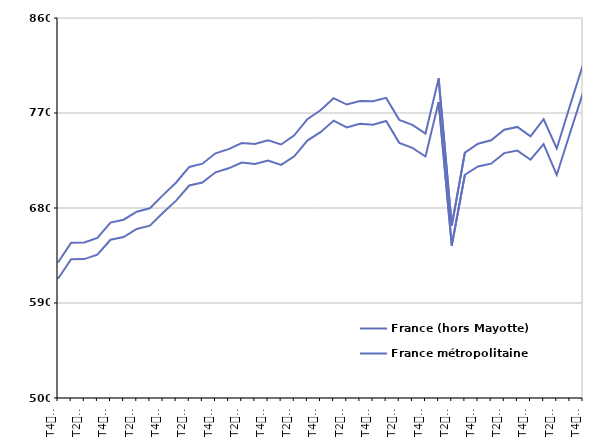
| Category | France (hors Mayotte) | France métropolitaine |
|---|---|---|
| T4
2012 | 628.4 | 613 |
| T1
2013 | 647.1 | 631.4 |
| T2
2013 | 647.4 | 631.6 |
| T3
2013 | 651.7 | 635.8 |
| T4
2013 | 666.2 | 649.9 |
| T1
2014 | 668.9 | 652.5 |
| T2
2014 | 676.5 | 660.1 |
| T3
2014 | 679.7 | 663.3 |
| T4
2014 | 692.2 | 675.5 |
| T1
2015 | 704.2 | 687 |
| T2
2015 | 718.9 | 701.3 |
| T3
2015 | 722 | 704.2 |
| T4
2015 | 731.8 | 713.8 |
| T1
2016 | 735.8 | 717.6 |
| T2
2016 | 741.5 | 723.1 |
| T3
2016 | 740.6 | 721.8 |
| T4
2016 | 744.2 | 724.9 |
| T1
2017 | 740.2 | 720.9 |
| T2
2017 | 748.8 | 729 |
| T3
2017 | 764.2 | 743.9 |
| T4
2017 | 772.6 | 751.8 |
| T1
2018 | 784 | 762.8 |
| T2
2018 | 778 | 756.3 |
| T3
2018 | 781.4 | 759.8 |
| T4
2018 | 781.1 | 758.9 |
| T1
2019 | 784.3 | 762.4 |
| T2
2019 | 763.5 | 741.7 |
| T3
2019 | 758.8 | 736.9 |
| T4
2019 | 750.5 | 728.8 |
| T1
2020 | 802.8 | 780.4 |
| T2
2020 | 663.3 | 644.5 |
| T3
2020 | 732.5 | 711.5 |
| T4
2020 | 740.9 | 719.4 |
| T1
2021 | 744.1 | 722 |
| T2
2021 | 754.1 | 732 |
| T3
2021 | 756.8 | 734.4 |
| T4
2021 | 747.9 | 725.7 |
| T1
2022 | 764.1 | 740.6 |
| T2
2022 | 736.4 | 711.3 |
| T3
2022 | 776.7 | 750.6 |
| T4
2022 | 815.9 | 789.3 |